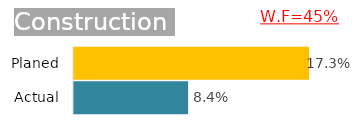
| Category | Construction |
|---|---|
| Actual | 0.084 |
| Planed | 0.173 |